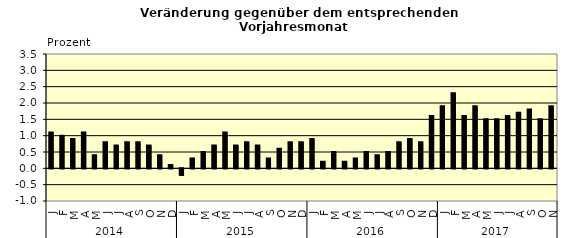
| Category | Series 0 |
|---|---|
| 0 | 1.1 |
| 1 | 1 |
| 2 | 0.9 |
| 3 | 1.1 |
| 4 | 0.4 |
| 5 | 0.8 |
| 6 | 0.7 |
| 7 | 0.8 |
| 8 | 0.8 |
| 9 | 0.7 |
| 10 | 0.4 |
| 11 | 0.1 |
| 12 | -0.2 |
| 13 | 0.3 |
| 14 | 0.5 |
| 15 | 0.7 |
| 16 | 1.1 |
| 17 | 0.7 |
| 18 | 0.8 |
| 19 | 0.7 |
| 20 | 0.3 |
| 21 | 0.6 |
| 22 | 0.8 |
| 23 | 0.8 |
| 24 | 0.9 |
| 25 | 0.2 |
| 26 | 0.5 |
| 27 | 0.2 |
| 28 | 0.3 |
| 29 | 0.5 |
| 30 | 0.4 |
| 31 | 0.5 |
| 32 | 0.8 |
| 33 | 0.9 |
| 34 | 0.8 |
| 35 | 1.6 |
| 36 | 1.9 |
| 37 | 2.3 |
| 38 | 1.6 |
| 39 | 1.9 |
| 40 | 1.5 |
| 41 | 1.5 |
| 42 | 1.6 |
| 43 | 1.7 |
| 44 | 1.8 |
| 45 | 1.5 |
| 46 | 1.9 |